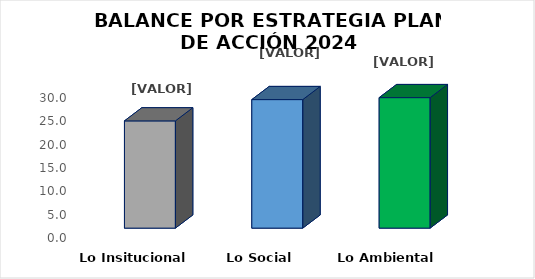
| Category | Series 0 |
|---|---|
| Lo Insitucional | 22.973 |
| Lo Social  | 27.533 |
| Lo Ambiental  | 27.957 |